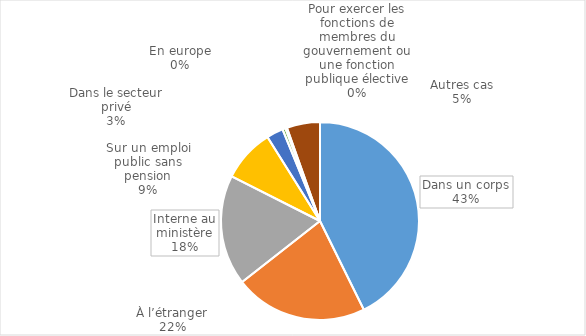
| Category | Détachement |
|---|---|
| Dans un corps | 18974 |
| À l’étranger | 9657 |
| Interne au ministère | 8012 |
| Sur un emploi public sans pension | 3841 |
| Dans le secteur privé | 1208 |
| En europe | 223 |
| Pour exercer les fonctions de membres du gouvernement ou une fonction publique élective | 114 |
| Autres cas | 2412 |